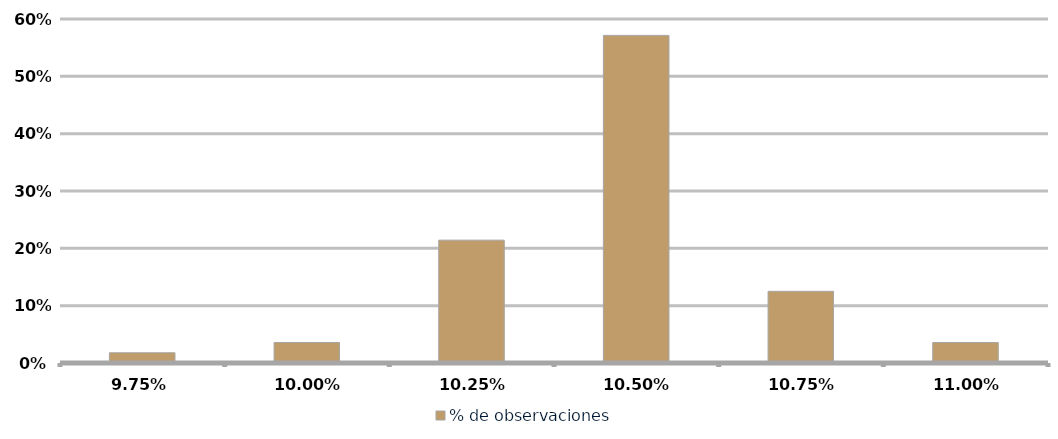
| Category | % de observaciones  |
|---|---|
| 0.09749999999999999 | 0.018 |
| 0.09999999999999999 | 0.036 |
| 0.1025 | 0.214 |
| 0.105 | 0.571 |
| 0.1075 | 0.125 |
| 0.11 | 0.036 |